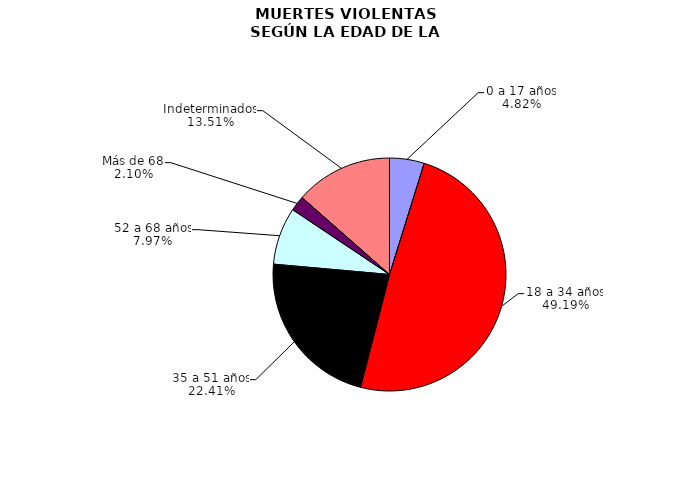
| Category | Series 0 |
|---|---|
| 0 a 17 años | 119 |
| 18 a 34 años | 1216 |
| 35 a 51 años | 554 |
| 52 a 68 años | 197 |
| Más de 68 | 52 |
| Indeterminados | 334 |